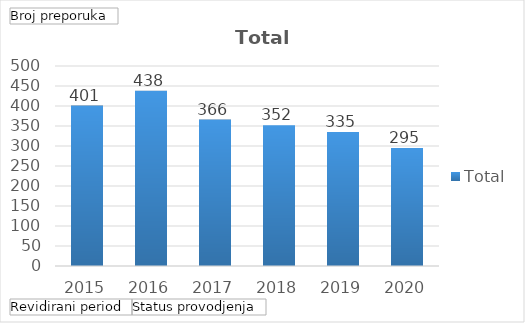
| Category | Total |
|---|---|
| 2015 | 401 |
| 2016 | 438 |
| 2017 | 366 |
| 2018 | 352 |
| 2019 | 335 |
| 2020 | 295 |